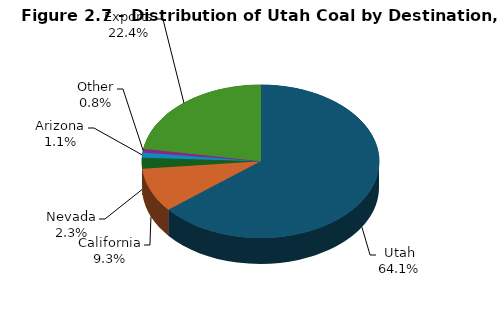
| Category | Series 0 |
|---|---|
| Utah | 9028.893 |
| California | 1315.011 |
| Nevada | 327.585 |
| Arizona | 152.808 |
| Other | 111.234 |
| Exports | 3148.3 |